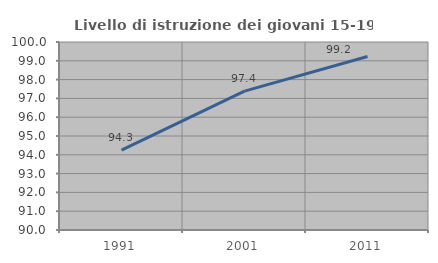
| Category | Livello di istruzione dei giovani 15-19 anni |
|---|---|
| 1991.0 | 94.253 |
| 2001.0 | 97.389 |
| 2011.0 | 99.229 |